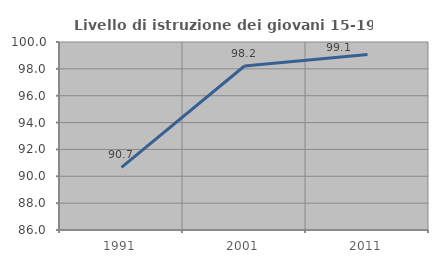
| Category | Livello di istruzione dei giovani 15-19 anni |
|---|---|
| 1991.0 | 90.664 |
| 2001.0 | 98.214 |
| 2011.0 | 99.068 |